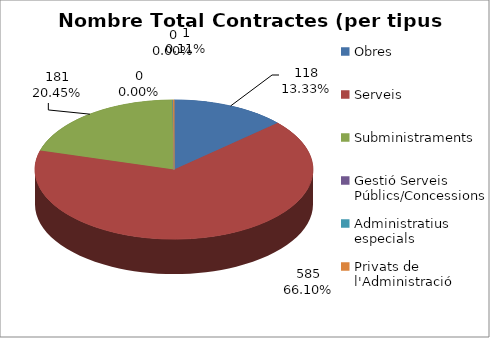
| Category | TOTALS per tipus contracte Nombre Total Contractes | TOTALS per tipus contracte % total import | Tipus de contracte | TOTALS per tipus contracte % total contractes |
|---|---|---|---|---|
| Obres | 118 | 0.303 |  | 0.133 |
| Serveis | 585 | 0.597 |  | 0.661 |
| Subministraments | 181 | 0.099 |  | 0.205 |
| Gestió Serveis Públics/Concessions | 0 | 0 |  | 0 |
| Administratius especials | 0 | 0 |  | 0 |
| Privats de l'Administració | 1 | 0 |  | 0.001 |